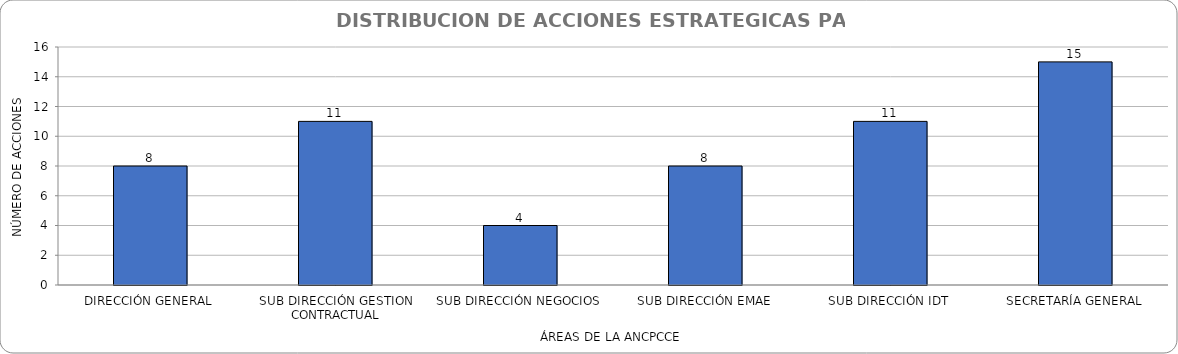
| Category | Series 0 |
|---|---|
| DIRECCIÓN GENERAL | 8 |
| SUB DIRECCIÓN GESTION CONTRACTUAL | 11 |
| SUB DIRECCIÓN NEGOCIOS | 4 |
| SUB DIRECCIÓN EMAE | 8 |
| SUB DIRECCIÓN IDT | 11 |
| SECRETARÍA GENERAL | 15 |